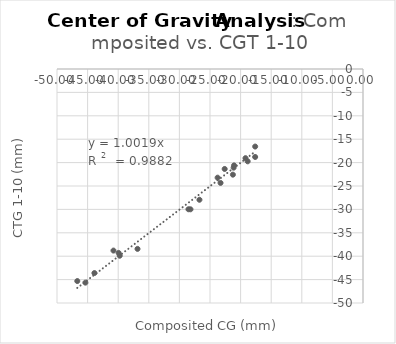
| Category | Series 0 |
|---|---|
| -28.18894794 | -29.98 |
| -26.7240805 | -27.94 |
| -28.51832379 | -29.97 |
| -21.07252122 | -20.6 |
| -21.2595369 | -22.58 |
| -17.61898474 | -18.8 |
| -17.61748497 | -16.57 |
| -21.13731749 | -21.08 |
| -23.75776856 | -23.22 |
| -19.20213911 | -19.05 |
| -23.27734448 | -24.34 |
| -22.60293532 | -21.36 |
| -18.84400738 | -19.73 |
| -43.8863264 | -43.6 |
| -39.93225996 | -39.3 |
| -39.75057807 | -39.9 |
| -40.7725108 | -38.8 |
| -36.84309459 | -38.44 |
| -46.68367386 | -45.31 |
| -45.35921099 | -45.65 |